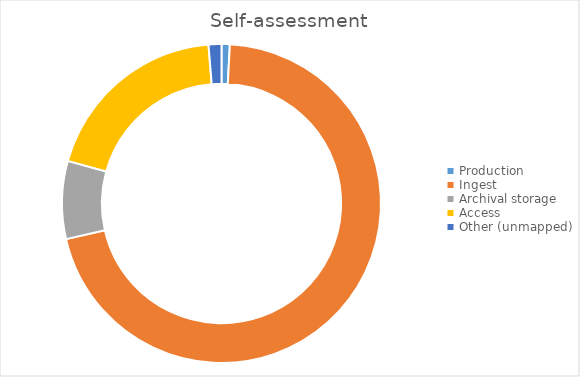
| Category | Cost |
|---|---|
| Production | 125750 |
| Ingest | 10572340 |
| Archival storage  | 1182340 |
| Access | 2904340 |
| Other (unmapped) | 195230 |